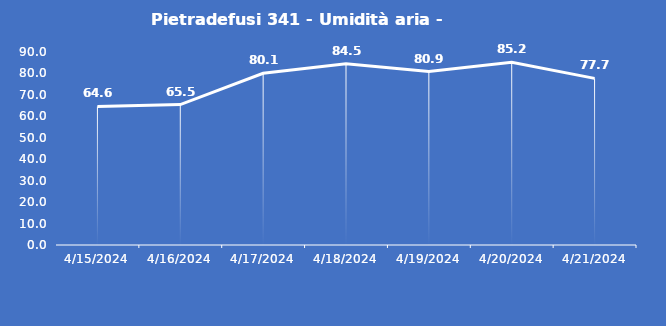
| Category | Pietradefusi 341 - Umidità aria - Grezzo (%) |
|---|---|
| 4/15/24 | 64.6 |
| 4/16/24 | 65.5 |
| 4/17/24 | 80.1 |
| 4/18/24 | 84.5 |
| 4/19/24 | 80.9 |
| 4/20/24 | 85.2 |
| 4/21/24 | 77.7 |